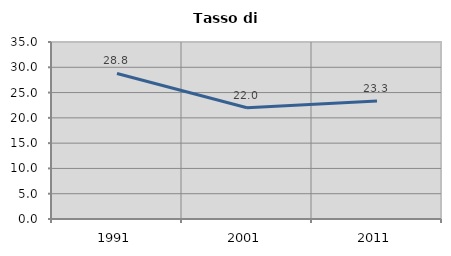
| Category | Tasso di disoccupazione   |
|---|---|
| 1991.0 | 28.783 |
| 2001.0 | 22.007 |
| 2011.0 | 23.345 |